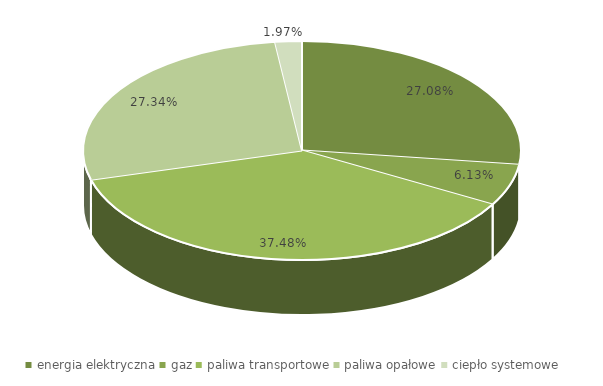
| Category | 2015 |
|---|---|
| energia elektryczna | 0.271 |
| gaz | 0.061 |
| paliwa transportowe | 0.375 |
| paliwa opałowe | 0.273 |
| ciepło systemowe | 0.02 |